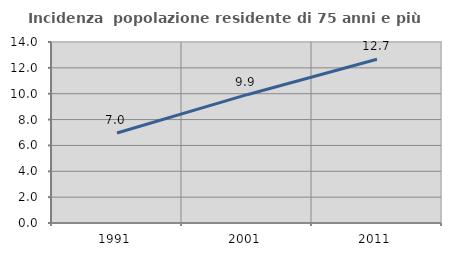
| Category | Incidenza  popolazione residente di 75 anni e più |
|---|---|
| 1991.0 | 6.964 |
| 2001.0 | 9.925 |
| 2011.0 | 12.663 |